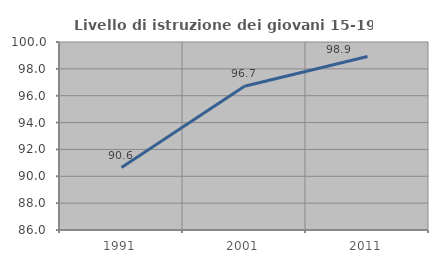
| Category | Livello di istruzione dei giovani 15-19 anni |
|---|---|
| 1991.0 | 90.647 |
| 2001.0 | 96.703 |
| 2011.0 | 98.925 |